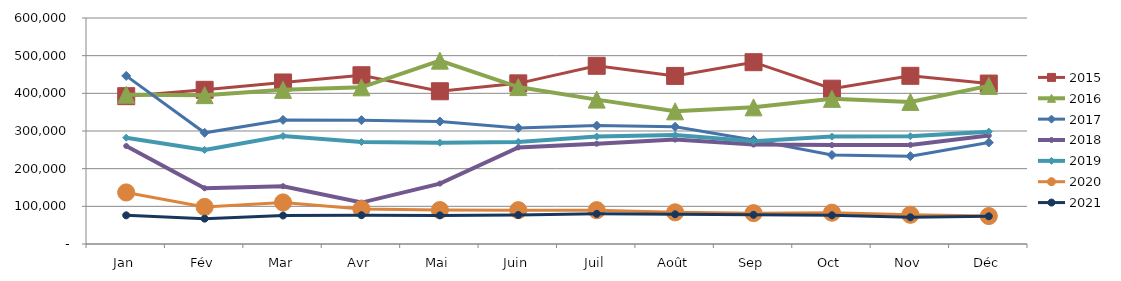
| Category | 2015 | 2016 | 2017 | 2018 | 2019 | 2020 | 2021 |
|---|---|---|---|---|---|---|---|
| Jan | 392455.386 | 396263.914 | 446281.806 | 260114.073 | 282172.738 | 136826.229 | 76108.624 |
| Fév | 409347.179 | 395175.975 | 295222.519 | 148036.843 | 249871.665 | 98396.552 | 67303.114 |
| Mar | 428838.698 | 409222.091 | 329338.872 | 153395.928 | 286777.302 | 110314.836 | 75650.537 |
| Avr | 448014.817 | 415901.642 | 328702.589 | 109982.902 | 270782.686 | 92890.727 | 76451.124 |
| Mai | 405528.286 | 486763.336 | 325158.457 | 160382.707 | 269027.301 | 90121.405 | 75984.328 |
| Juin | 426462.87 | 416602.613 | 308100.463 | 256426.409 | 271108.83 | 89786.547 | 76856.752 |
| Juil | 473107.942 | 383313.72 | 314407.38 | 266269.669 | 285234.508 | 89814.637 | 80056.224 |
| Août | 446267.927 | 352198.565 | 311304.785 | 277231.878 | 289072.19 | 84074.92 | 78850.18 |
| Sep | 482677.503 | 362763.978 | 276260.727 | 263963.731 | 272549.159 | 81924.261 | 77443.819 |
| Oct | 412311.701 | 385353.331 | 236379.756 | 262549.621 | 285123.451 | 83105.986 | 76213.237 |
| Nov | 446526.169 | 377201.543 | 233251.128 | 263155.863 | 286119.242 | 77551.508 | 71055.468 |
| Déc | 425963.85 | 419714.854 | 269424.356 | 287963.859 | 298314.346 | 74219.32 | 73557.444 |